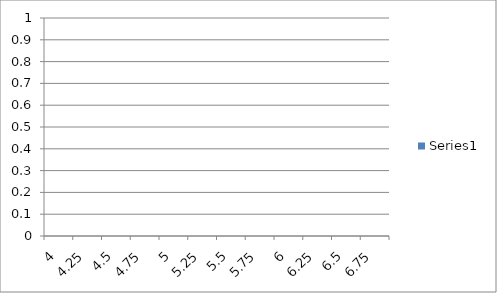
| Category | Series 0 |
|---|---|
| 4.0 | 0 |
| 4.25 | 0 |
| 4.5 | 0 |
| 4.75 | 0 |
| 5.0 | 0 |
| 5.25 | 0 |
| 5.5 | 0 |
| 5.75 | 0 |
| 6.0 | 0 |
| 6.25 | 0 |
| 6.5 | 0 |
| 6.75 | 0 |